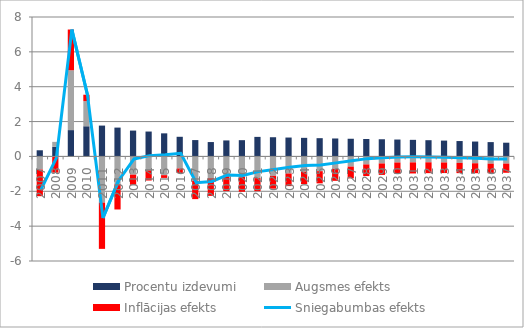
| Category | Procentu izdevumi | Augsmes efekts | Inflācijas efekts |
|---|---|---|---|
| 0 | 0.353 | -0.754 | -1.527 |
| 1 | 0.551 | 0.285 | -0.933 |
| 2 | 1.511 | 3.434 | 2.337 |
| 3 | 1.731 | 1.442 | 0.368 |
| 4 | 1.77 | -2.65 | -2.655 |
| 5 | 1.655 | -1.594 | -1.45 |
| 6 | 1.483 | -1.047 | -0.579 |
| 7 | 1.428 | -0.798 | -0.585 |
| 8 | 1.324 | -1.075 | -0.157 |
| 9 | 1.127 | -0.694 | -0.255 |
| 10 | 0.938 | -1.39 | -1.06 |
| 11 | 0.825 | -1.245 | -1.018 |
| 12 | 0.918 | -1.135 | -0.853 |
| 13 | 0.933 | -1.17 | -0.858 |
| 14 | 1.121 | -1.245 | -0.748 |
| 15 | 1.102 | -1.116 | -0.734 |
| 16 | 1.084 | -0.98 | -0.722 |
| 17 | 1.066 | -0.877 | -0.711 |
| 18 | 1.047 | -0.847 | -0.698 |
| 19 | 1.03 | -0.713 | -0.687 |
| 20 | 1.014 | -0.584 | -0.676 |
| 21 | 1 | -0.46 | -0.667 |
| 22 | 0.985 | -0.404 | -0.657 |
| 23 | 0.969 | -0.349 | -0.646 |
| 24 | 0.952 | -0.343 | -0.634 |
| 25 | 0.932 | -0.338 | -0.621 |
| 26 | 0.909 | -0.348 | -0.606 |
| 27 | 0.883 | -0.371 | -0.589 |
| 28 | 0.854 | -0.393 | -0.569 |
| 29 | 0.822 | -0.416 | -0.548 |
| 30 | 0.787 | -0.412 | -0.525 |